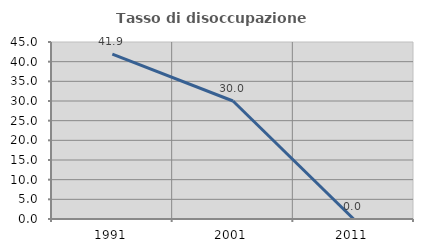
| Category | Tasso di disoccupazione giovanile  |
|---|---|
| 1991.0 | 41.935 |
| 2001.0 | 30 |
| 2011.0 | 0 |